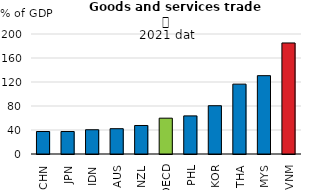
| Category | Series 0 |
|---|---|
| CHN | 37.479 |
| JPN | 37.518 |
| IDN | 40.423 |
| AUS | 42.164 |
| NZL | 47.517 |
| OECD | 59.697 |
| PHL | 63.502 |
| KOR | 80.492 |
| THA | 116.444 |
| MYS | 130.57 |
| VNM | 185.059 |